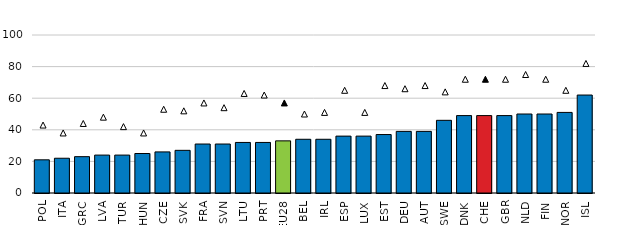
| Category | All |
|---|---|
| POL | 21 |
| ITA | 22 |
| GRC | 23 |
| LVA | 24 |
| TUR | 24 |
| HUN | 25 |
| CZE | 26 |
| SVK | 27 |
| FRA | 31 |
| SVN | 31 |
| LTU | 32 |
| PRT | 32 |
| EU28 | 33 |
| BEL | 34 |
| IRL | 34 |
| ESP | 36 |
| LUX | 36 |
| EST | 37 |
| DEU | 39 |
| AUT | 39 |
| SWE | 46 |
| DNK | 49 |
| CHE | 49 |
| GBR | 49 |
| NLD | 50 |
| FIN | 50 |
| NOR | 51 |
| ISL | 62 |